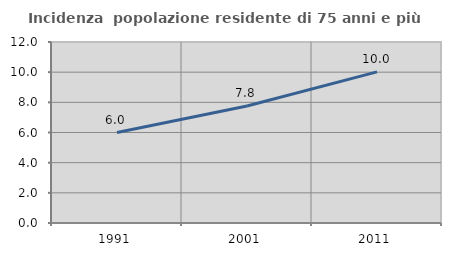
| Category | Incidenza  popolazione residente di 75 anni e più |
|---|---|
| 1991.0 | 5.996 |
| 2001.0 | 7.752 |
| 2011.0 | 10.018 |